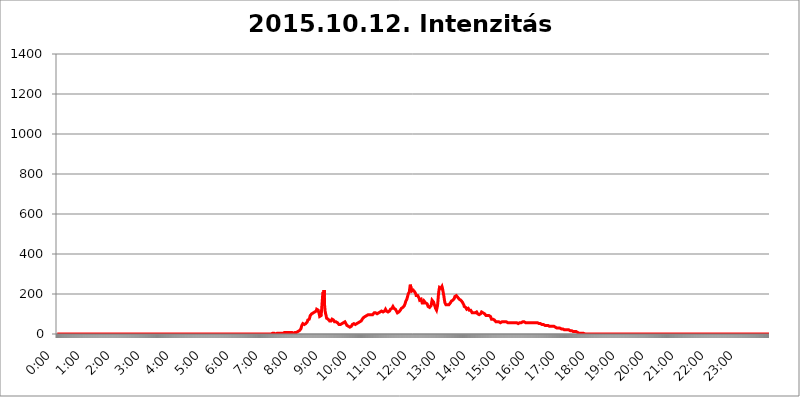
| Category | 2015.10.12. Intenzitás [W/m^2] |
|---|---|
| 0.0 | 0 |
| 0.0006944444444444445 | 0 |
| 0.001388888888888889 | 0 |
| 0.0020833333333333333 | 0 |
| 0.002777777777777778 | 0 |
| 0.003472222222222222 | 0 |
| 0.004166666666666667 | 0 |
| 0.004861111111111111 | 0 |
| 0.005555555555555556 | 0 |
| 0.0062499999999999995 | 0 |
| 0.006944444444444444 | 0 |
| 0.007638888888888889 | 0 |
| 0.008333333333333333 | 0 |
| 0.009027777777777779 | 0 |
| 0.009722222222222222 | 0 |
| 0.010416666666666666 | 0 |
| 0.011111111111111112 | 0 |
| 0.011805555555555555 | 0 |
| 0.012499999999999999 | 0 |
| 0.013194444444444444 | 0 |
| 0.013888888888888888 | 0 |
| 0.014583333333333332 | 0 |
| 0.015277777777777777 | 0 |
| 0.015972222222222224 | 0 |
| 0.016666666666666666 | 0 |
| 0.017361111111111112 | 0 |
| 0.018055555555555557 | 0 |
| 0.01875 | 0 |
| 0.019444444444444445 | 0 |
| 0.02013888888888889 | 0 |
| 0.020833333333333332 | 0 |
| 0.02152777777777778 | 0 |
| 0.022222222222222223 | 0 |
| 0.02291666666666667 | 0 |
| 0.02361111111111111 | 0 |
| 0.024305555555555556 | 0 |
| 0.024999999999999998 | 0 |
| 0.025694444444444447 | 0 |
| 0.02638888888888889 | 0 |
| 0.027083333333333334 | 0 |
| 0.027777777777777776 | 0 |
| 0.02847222222222222 | 0 |
| 0.029166666666666664 | 0 |
| 0.029861111111111113 | 0 |
| 0.030555555555555555 | 0 |
| 0.03125 | 0 |
| 0.03194444444444445 | 0 |
| 0.03263888888888889 | 0 |
| 0.03333333333333333 | 0 |
| 0.034027777777777775 | 0 |
| 0.034722222222222224 | 0 |
| 0.035416666666666666 | 0 |
| 0.036111111111111115 | 0 |
| 0.03680555555555556 | 0 |
| 0.0375 | 0 |
| 0.03819444444444444 | 0 |
| 0.03888888888888889 | 0 |
| 0.03958333333333333 | 0 |
| 0.04027777777777778 | 0 |
| 0.04097222222222222 | 0 |
| 0.041666666666666664 | 0 |
| 0.042361111111111106 | 0 |
| 0.04305555555555556 | 0 |
| 0.043750000000000004 | 0 |
| 0.044444444444444446 | 0 |
| 0.04513888888888889 | 0 |
| 0.04583333333333334 | 0 |
| 0.04652777777777778 | 0 |
| 0.04722222222222222 | 0 |
| 0.04791666666666666 | 0 |
| 0.04861111111111111 | 0 |
| 0.049305555555555554 | 0 |
| 0.049999999999999996 | 0 |
| 0.05069444444444445 | 0 |
| 0.051388888888888894 | 0 |
| 0.052083333333333336 | 0 |
| 0.05277777777777778 | 0 |
| 0.05347222222222222 | 0 |
| 0.05416666666666667 | 0 |
| 0.05486111111111111 | 0 |
| 0.05555555555555555 | 0 |
| 0.05625 | 0 |
| 0.05694444444444444 | 0 |
| 0.057638888888888885 | 0 |
| 0.05833333333333333 | 0 |
| 0.05902777777777778 | 0 |
| 0.059722222222222225 | 0 |
| 0.06041666666666667 | 0 |
| 0.061111111111111116 | 0 |
| 0.06180555555555556 | 0 |
| 0.0625 | 0 |
| 0.06319444444444444 | 0 |
| 0.06388888888888888 | 0 |
| 0.06458333333333334 | 0 |
| 0.06527777777777778 | 0 |
| 0.06597222222222222 | 0 |
| 0.06666666666666667 | 0 |
| 0.06736111111111111 | 0 |
| 0.06805555555555555 | 0 |
| 0.06874999999999999 | 0 |
| 0.06944444444444443 | 0 |
| 0.07013888888888889 | 0 |
| 0.07083333333333333 | 0 |
| 0.07152777777777779 | 0 |
| 0.07222222222222223 | 0 |
| 0.07291666666666667 | 0 |
| 0.07361111111111111 | 0 |
| 0.07430555555555556 | 0 |
| 0.075 | 0 |
| 0.07569444444444444 | 0 |
| 0.0763888888888889 | 0 |
| 0.07708333333333334 | 0 |
| 0.07777777777777778 | 0 |
| 0.07847222222222222 | 0 |
| 0.07916666666666666 | 0 |
| 0.0798611111111111 | 0 |
| 0.08055555555555556 | 0 |
| 0.08125 | 0 |
| 0.08194444444444444 | 0 |
| 0.08263888888888889 | 0 |
| 0.08333333333333333 | 0 |
| 0.08402777777777777 | 0 |
| 0.08472222222222221 | 0 |
| 0.08541666666666665 | 0 |
| 0.08611111111111112 | 0 |
| 0.08680555555555557 | 0 |
| 0.08750000000000001 | 0 |
| 0.08819444444444445 | 0 |
| 0.08888888888888889 | 0 |
| 0.08958333333333333 | 0 |
| 0.09027777777777778 | 0 |
| 0.09097222222222222 | 0 |
| 0.09166666666666667 | 0 |
| 0.09236111111111112 | 0 |
| 0.09305555555555556 | 0 |
| 0.09375 | 0 |
| 0.09444444444444444 | 0 |
| 0.09513888888888888 | 0 |
| 0.09583333333333333 | 0 |
| 0.09652777777777777 | 0 |
| 0.09722222222222222 | 0 |
| 0.09791666666666667 | 0 |
| 0.09861111111111111 | 0 |
| 0.09930555555555555 | 0 |
| 0.09999999999999999 | 0 |
| 0.10069444444444443 | 0 |
| 0.1013888888888889 | 0 |
| 0.10208333333333335 | 0 |
| 0.10277777777777779 | 0 |
| 0.10347222222222223 | 0 |
| 0.10416666666666667 | 0 |
| 0.10486111111111111 | 0 |
| 0.10555555555555556 | 0 |
| 0.10625 | 0 |
| 0.10694444444444444 | 0 |
| 0.1076388888888889 | 0 |
| 0.10833333333333334 | 0 |
| 0.10902777777777778 | 0 |
| 0.10972222222222222 | 0 |
| 0.1111111111111111 | 0 |
| 0.11180555555555556 | 0 |
| 0.11180555555555556 | 0 |
| 0.1125 | 0 |
| 0.11319444444444444 | 0 |
| 0.11388888888888889 | 0 |
| 0.11458333333333333 | 0 |
| 0.11527777777777777 | 0 |
| 0.11597222222222221 | 0 |
| 0.11666666666666665 | 0 |
| 0.1173611111111111 | 0 |
| 0.11805555555555557 | 0 |
| 0.11944444444444445 | 0 |
| 0.12013888888888889 | 0 |
| 0.12083333333333333 | 0 |
| 0.12152777777777778 | 0 |
| 0.12222222222222223 | 0 |
| 0.12291666666666667 | 0 |
| 0.12291666666666667 | 0 |
| 0.12361111111111112 | 0 |
| 0.12430555555555556 | 0 |
| 0.125 | 0 |
| 0.12569444444444444 | 0 |
| 0.12638888888888888 | 0 |
| 0.12708333333333333 | 0 |
| 0.16875 | 0 |
| 0.12847222222222224 | 0 |
| 0.12916666666666668 | 0 |
| 0.12986111111111112 | 0 |
| 0.13055555555555556 | 0 |
| 0.13125 | 0 |
| 0.13194444444444445 | 0 |
| 0.1326388888888889 | 0 |
| 0.13333333333333333 | 0 |
| 0.13402777777777777 | 0 |
| 0.13402777777777777 | 0 |
| 0.13472222222222222 | 0 |
| 0.13541666666666666 | 0 |
| 0.1361111111111111 | 0 |
| 0.13749999999999998 | 0 |
| 0.13819444444444443 | 0 |
| 0.1388888888888889 | 0 |
| 0.13958333333333334 | 0 |
| 0.14027777777777778 | 0 |
| 0.14097222222222222 | 0 |
| 0.14166666666666666 | 0 |
| 0.1423611111111111 | 0 |
| 0.14305555555555557 | 0 |
| 0.14375000000000002 | 0 |
| 0.14444444444444446 | 0 |
| 0.1451388888888889 | 0 |
| 0.1451388888888889 | 0 |
| 0.14652777777777778 | 0 |
| 0.14722222222222223 | 0 |
| 0.14791666666666667 | 0 |
| 0.1486111111111111 | 0 |
| 0.14930555555555555 | 0 |
| 0.15 | 0 |
| 0.15069444444444444 | 0 |
| 0.15138888888888888 | 0 |
| 0.15208333333333332 | 0 |
| 0.15277777777777776 | 0 |
| 0.15347222222222223 | 0 |
| 0.15416666666666667 | 0 |
| 0.15486111111111112 | 0 |
| 0.15555555555555556 | 0 |
| 0.15625 | 0 |
| 0.15694444444444444 | 0 |
| 0.15763888888888888 | 0 |
| 0.15833333333333333 | 0 |
| 0.15902777777777777 | 0 |
| 0.15972222222222224 | 0 |
| 0.16041666666666668 | 0 |
| 0.16111111111111112 | 0 |
| 0.16180555555555556 | 0 |
| 0.1625 | 0 |
| 0.16319444444444445 | 0 |
| 0.1638888888888889 | 0 |
| 0.16458333333333333 | 0 |
| 0.16527777777777777 | 0 |
| 0.16597222222222222 | 0 |
| 0.16666666666666666 | 0 |
| 0.1673611111111111 | 0 |
| 0.16805555555555554 | 0 |
| 0.16874999999999998 | 0 |
| 0.16944444444444443 | 0 |
| 0.17013888888888887 | 0 |
| 0.1708333333333333 | 0 |
| 0.17152777777777775 | 0 |
| 0.17222222222222225 | 0 |
| 0.1729166666666667 | 0 |
| 0.17361111111111113 | 0 |
| 0.17430555555555557 | 0 |
| 0.17500000000000002 | 0 |
| 0.17569444444444446 | 0 |
| 0.1763888888888889 | 0 |
| 0.17708333333333334 | 0 |
| 0.17777777777777778 | 0 |
| 0.17847222222222223 | 0 |
| 0.17916666666666667 | 0 |
| 0.1798611111111111 | 0 |
| 0.18055555555555555 | 0 |
| 0.18125 | 0 |
| 0.18194444444444444 | 0 |
| 0.1826388888888889 | 0 |
| 0.18333333333333335 | 0 |
| 0.1840277777777778 | 0 |
| 0.18472222222222223 | 0 |
| 0.18541666666666667 | 0 |
| 0.18611111111111112 | 0 |
| 0.18680555555555556 | 0 |
| 0.1875 | 0 |
| 0.18819444444444444 | 0 |
| 0.18888888888888888 | 0 |
| 0.18958333333333333 | 0 |
| 0.19027777777777777 | 0 |
| 0.1909722222222222 | 0 |
| 0.19166666666666665 | 0 |
| 0.19236111111111112 | 0 |
| 0.19305555555555554 | 0 |
| 0.19375 | 0 |
| 0.19444444444444445 | 0 |
| 0.1951388888888889 | 0 |
| 0.19583333333333333 | 0 |
| 0.19652777777777777 | 0 |
| 0.19722222222222222 | 0 |
| 0.19791666666666666 | 0 |
| 0.1986111111111111 | 0 |
| 0.19930555555555554 | 0 |
| 0.19999999999999998 | 0 |
| 0.20069444444444443 | 0 |
| 0.20138888888888887 | 0 |
| 0.2020833333333333 | 0 |
| 0.2027777777777778 | 0 |
| 0.2034722222222222 | 0 |
| 0.2041666666666667 | 0 |
| 0.20486111111111113 | 0 |
| 0.20555555555555557 | 0 |
| 0.20625000000000002 | 0 |
| 0.20694444444444446 | 0 |
| 0.2076388888888889 | 0 |
| 0.20833333333333334 | 0 |
| 0.20902777777777778 | 0 |
| 0.20972222222222223 | 0 |
| 0.21041666666666667 | 0 |
| 0.2111111111111111 | 0 |
| 0.21180555555555555 | 0 |
| 0.2125 | 0 |
| 0.21319444444444444 | 0 |
| 0.2138888888888889 | 0 |
| 0.21458333333333335 | 0 |
| 0.2152777777777778 | 0 |
| 0.21597222222222223 | 0 |
| 0.21666666666666667 | 0 |
| 0.21736111111111112 | 0 |
| 0.21805555555555556 | 0 |
| 0.21875 | 0 |
| 0.21944444444444444 | 0 |
| 0.22013888888888888 | 0 |
| 0.22083333333333333 | 0 |
| 0.22152777777777777 | 0 |
| 0.2222222222222222 | 0 |
| 0.22291666666666665 | 0 |
| 0.2236111111111111 | 0 |
| 0.22430555555555556 | 0 |
| 0.225 | 0 |
| 0.22569444444444445 | 0 |
| 0.2263888888888889 | 0 |
| 0.22708333333333333 | 0 |
| 0.22777777777777777 | 0 |
| 0.22847222222222222 | 0 |
| 0.22916666666666666 | 0 |
| 0.2298611111111111 | 0 |
| 0.23055555555555554 | 0 |
| 0.23124999999999998 | 0 |
| 0.23194444444444443 | 0 |
| 0.23263888888888887 | 0 |
| 0.2333333333333333 | 0 |
| 0.2340277777777778 | 0 |
| 0.2347222222222222 | 0 |
| 0.2354166666666667 | 0 |
| 0.23611111111111113 | 0 |
| 0.23680555555555557 | 0 |
| 0.23750000000000002 | 0 |
| 0.23819444444444446 | 0 |
| 0.2388888888888889 | 0 |
| 0.23958333333333334 | 0 |
| 0.24027777777777778 | 0 |
| 0.24097222222222223 | 0 |
| 0.24166666666666667 | 0 |
| 0.2423611111111111 | 0 |
| 0.24305555555555555 | 0 |
| 0.24375 | 0 |
| 0.24444444444444446 | 0 |
| 0.24513888888888888 | 0 |
| 0.24583333333333335 | 0 |
| 0.2465277777777778 | 0 |
| 0.24722222222222223 | 0 |
| 0.24791666666666667 | 0 |
| 0.24861111111111112 | 0 |
| 0.24930555555555556 | 0 |
| 0.25 | 0 |
| 0.25069444444444444 | 0 |
| 0.2513888888888889 | 0 |
| 0.2520833333333333 | 0 |
| 0.25277777777777777 | 0 |
| 0.2534722222222222 | 0 |
| 0.25416666666666665 | 0 |
| 0.2548611111111111 | 0 |
| 0.2555555555555556 | 0 |
| 0.25625000000000003 | 0 |
| 0.2569444444444445 | 0 |
| 0.2576388888888889 | 0 |
| 0.25833333333333336 | 0 |
| 0.2590277777777778 | 0 |
| 0.25972222222222224 | 0 |
| 0.2604166666666667 | 0 |
| 0.2611111111111111 | 0 |
| 0.26180555555555557 | 0 |
| 0.2625 | 0 |
| 0.26319444444444445 | 0 |
| 0.2638888888888889 | 0 |
| 0.26458333333333334 | 0 |
| 0.2652777777777778 | 0 |
| 0.2659722222222222 | 0 |
| 0.26666666666666666 | 0 |
| 0.2673611111111111 | 0 |
| 0.26805555555555555 | 0 |
| 0.26875 | 0 |
| 0.26944444444444443 | 0 |
| 0.2701388888888889 | 0 |
| 0.2708333333333333 | 0 |
| 0.27152777777777776 | 0 |
| 0.2722222222222222 | 0 |
| 0.27291666666666664 | 0 |
| 0.2736111111111111 | 0 |
| 0.2743055555555555 | 0 |
| 0.27499999999999997 | 0 |
| 0.27569444444444446 | 0 |
| 0.27638888888888885 | 0 |
| 0.27708333333333335 | 0 |
| 0.2777777777777778 | 0 |
| 0.27847222222222223 | 0 |
| 0.2791666666666667 | 0 |
| 0.2798611111111111 | 0 |
| 0.28055555555555556 | 0 |
| 0.28125 | 0 |
| 0.28194444444444444 | 0 |
| 0.2826388888888889 | 0 |
| 0.2833333333333333 | 0 |
| 0.28402777777777777 | 0 |
| 0.2847222222222222 | 0 |
| 0.28541666666666665 | 0 |
| 0.28611111111111115 | 0 |
| 0.28680555555555554 | 0 |
| 0.28750000000000003 | 0 |
| 0.2881944444444445 | 0 |
| 0.2888888888888889 | 0 |
| 0.28958333333333336 | 0 |
| 0.2902777777777778 | 0 |
| 0.29097222222222224 | 0 |
| 0.2916666666666667 | 0 |
| 0.2923611111111111 | 0 |
| 0.29305555555555557 | 0 |
| 0.29375 | 0 |
| 0.29444444444444445 | 0 |
| 0.2951388888888889 | 0 |
| 0.29583333333333334 | 0 |
| 0.2965277777777778 | 0 |
| 0.2972222222222222 | 0 |
| 0.29791666666666666 | 0 |
| 0.2986111111111111 | 0 |
| 0.29930555555555555 | 0 |
| 0.3 | 0 |
| 0.30069444444444443 | 0 |
| 0.3013888888888889 | 0 |
| 0.3020833333333333 | 3.525 |
| 0.30277777777777776 | 3.525 |
| 0.3034722222222222 | 3.525 |
| 0.30416666666666664 | 3.525 |
| 0.3048611111111111 | 0 |
| 0.3055555555555555 | 0 |
| 0.30624999999999997 | 0 |
| 0.3069444444444444 | 3.525 |
| 0.3076388888888889 | 3.525 |
| 0.30833333333333335 | 3.525 |
| 0.3090277777777778 | 3.525 |
| 0.30972222222222223 | 3.525 |
| 0.3104166666666667 | 3.525 |
| 0.3111111111111111 | 3.525 |
| 0.31180555555555556 | 3.525 |
| 0.3125 | 3.525 |
| 0.31319444444444444 | 3.525 |
| 0.3138888888888889 | 3.525 |
| 0.3145833333333333 | 3.525 |
| 0.31527777777777777 | 3.525 |
| 0.3159722222222222 | 3.525 |
| 0.31666666666666665 | 3.525 |
| 0.31736111111111115 | 3.525 |
| 0.31805555555555554 | 3.525 |
| 0.31875000000000003 | 7.887 |
| 0.3194444444444445 | 7.887 |
| 0.3201388888888889 | 3.525 |
| 0.32083333333333336 | 7.887 |
| 0.3215277777777778 | 7.887 |
| 0.32222222222222224 | 7.887 |
| 0.3229166666666667 | 7.887 |
| 0.3236111111111111 | 7.887 |
| 0.32430555555555557 | 7.887 |
| 0.325 | 7.887 |
| 0.32569444444444445 | 7.887 |
| 0.3263888888888889 | 7.887 |
| 0.32708333333333334 | 7.887 |
| 0.3277777777777778 | 7.887 |
| 0.3284722222222222 | 7.887 |
| 0.32916666666666666 | 7.887 |
| 0.3298611111111111 | 3.525 |
| 0.33055555555555555 | 3.525 |
| 0.33125 | 3.525 |
| 0.33194444444444443 | 3.525 |
| 0.3326388888888889 | 3.525 |
| 0.3333333333333333 | 7.887 |
| 0.3340277777777778 | 7.887 |
| 0.3347222222222222 | 7.887 |
| 0.3354166666666667 | 7.887 |
| 0.3361111111111111 | 7.887 |
| 0.3368055555555556 | 12.257 |
| 0.33749999999999997 | 12.257 |
| 0.33819444444444446 | 12.257 |
| 0.33888888888888885 | 12.257 |
| 0.33958333333333335 | 16.636 |
| 0.34027777777777773 | 16.636 |
| 0.34097222222222223 | 21.024 |
| 0.3416666666666666 | 25.419 |
| 0.3423611111111111 | 34.234 |
| 0.3430555555555555 | 43.079 |
| 0.34375 | 47.511 |
| 0.3444444444444445 | 51.951 |
| 0.3451388888888889 | 51.951 |
| 0.3458333333333334 | 47.511 |
| 0.34652777777777777 | 47.511 |
| 0.34722222222222227 | 47.511 |
| 0.34791666666666665 | 47.511 |
| 0.34861111111111115 | 51.951 |
| 0.34930555555555554 | 56.398 |
| 0.35000000000000003 | 56.398 |
| 0.3506944444444444 | 60.85 |
| 0.3513888888888889 | 69.775 |
| 0.3520833333333333 | 74.246 |
| 0.3527777777777778 | 74.246 |
| 0.3534722222222222 | 74.246 |
| 0.3541666666666667 | 83.205 |
| 0.3548611111111111 | 92.184 |
| 0.35555555555555557 | 87.692 |
| 0.35625 | 92.184 |
| 0.35694444444444445 | 101.184 |
| 0.3576388888888889 | 105.69 |
| 0.35833333333333334 | 105.69 |
| 0.3590277777777778 | 105.69 |
| 0.3597222222222222 | 105.69 |
| 0.36041666666666666 | 110.201 |
| 0.3611111111111111 | 110.201 |
| 0.36180555555555555 | 110.201 |
| 0.3625 | 110.201 |
| 0.36319444444444443 | 114.716 |
| 0.3638888888888889 | 123.758 |
| 0.3645833333333333 | 128.284 |
| 0.3652777777777778 | 119.235 |
| 0.3659722222222222 | 119.235 |
| 0.3666666666666667 | 119.235 |
| 0.3673611111111111 | 101.184 |
| 0.3680555555555556 | 87.692 |
| 0.36874999999999997 | 83.205 |
| 0.36944444444444446 | 83.205 |
| 0.37013888888888885 | 92.184 |
| 0.37083333333333335 | 123.758 |
| 0.37152777777777773 | 128.284 |
| 0.37222222222222223 | 191.937 |
| 0.3729166666666666 | 210.182 |
| 0.3736111111111111 | 191.937 |
| 0.3743055555555555 | 219.309 |
| 0.375 | 141.884 |
| 0.3756944444444445 | 114.716 |
| 0.3763888888888889 | 101.184 |
| 0.3770833333333334 | 92.184 |
| 0.37777777777777777 | 78.722 |
| 0.37847222222222227 | 74.246 |
| 0.37916666666666665 | 78.722 |
| 0.37986111111111115 | 74.246 |
| 0.38055555555555554 | 74.246 |
| 0.38125000000000003 | 69.775 |
| 0.3819444444444444 | 65.31 |
| 0.3826388888888889 | 65.31 |
| 0.3833333333333333 | 65.31 |
| 0.3840277777777778 | 65.31 |
| 0.3847222222222222 | 69.775 |
| 0.3854166666666667 | 74.246 |
| 0.3861111111111111 | 74.246 |
| 0.38680555555555557 | 74.246 |
| 0.3875 | 69.775 |
| 0.38819444444444445 | 65.31 |
| 0.3888888888888889 | 60.85 |
| 0.38958333333333334 | 65.31 |
| 0.3902777777777778 | 65.31 |
| 0.3909722222222222 | 60.85 |
| 0.39166666666666666 | 60.85 |
| 0.3923611111111111 | 56.398 |
| 0.39305555555555555 | 56.398 |
| 0.39375 | 56.398 |
| 0.39444444444444443 | 51.951 |
| 0.3951388888888889 | 47.511 |
| 0.3958333333333333 | 47.511 |
| 0.3965277777777778 | 47.511 |
| 0.3972222222222222 | 47.511 |
| 0.3979166666666667 | 51.951 |
| 0.3986111111111111 | 51.951 |
| 0.3993055555555556 | 51.951 |
| 0.39999999999999997 | 51.951 |
| 0.40069444444444446 | 51.951 |
| 0.40138888888888885 | 56.398 |
| 0.40208333333333335 | 60.85 |
| 0.40277777777777773 | 60.85 |
| 0.40347222222222223 | 60.85 |
| 0.4041666666666666 | 56.398 |
| 0.4048611111111111 | 51.951 |
| 0.4055555555555555 | 51.951 |
| 0.40625 | 43.079 |
| 0.4069444444444445 | 38.653 |
| 0.4076388888888889 | 38.653 |
| 0.4083333333333334 | 38.653 |
| 0.40902777777777777 | 34.234 |
| 0.40972222222222227 | 34.234 |
| 0.41041666666666665 | 34.234 |
| 0.41111111111111115 | 34.234 |
| 0.41180555555555554 | 38.653 |
| 0.41250000000000003 | 38.653 |
| 0.4131944444444444 | 43.079 |
| 0.4138888888888889 | 47.511 |
| 0.4145833333333333 | 47.511 |
| 0.4152777777777778 | 51.951 |
| 0.4159722222222222 | 51.951 |
| 0.4166666666666667 | 51.951 |
| 0.4173611111111111 | 51.951 |
| 0.41805555555555557 | 47.511 |
| 0.41875 | 51.951 |
| 0.41944444444444445 | 51.951 |
| 0.4201388888888889 | 51.951 |
| 0.42083333333333334 | 51.951 |
| 0.4215277777777778 | 56.398 |
| 0.4222222222222222 | 56.398 |
| 0.42291666666666666 | 60.85 |
| 0.4236111111111111 | 60.85 |
| 0.42430555555555555 | 60.85 |
| 0.425 | 65.31 |
| 0.42569444444444443 | 65.31 |
| 0.4263888888888889 | 65.31 |
| 0.4270833333333333 | 69.775 |
| 0.4277777777777778 | 74.246 |
| 0.4284722222222222 | 74.246 |
| 0.4291666666666667 | 78.722 |
| 0.4298611111111111 | 83.205 |
| 0.4305555555555556 | 83.205 |
| 0.43124999999999997 | 87.692 |
| 0.43194444444444446 | 87.692 |
| 0.43263888888888885 | 92.184 |
| 0.43333333333333335 | 92.184 |
| 0.43402777777777773 | 92.184 |
| 0.43472222222222223 | 96.682 |
| 0.4354166666666666 | 96.682 |
| 0.4361111111111111 | 96.682 |
| 0.4368055555555555 | 96.682 |
| 0.4375 | 96.682 |
| 0.4381944444444445 | 96.682 |
| 0.4388888888888889 | 101.184 |
| 0.4395833333333334 | 101.184 |
| 0.44027777777777777 | 96.682 |
| 0.44097222222222227 | 96.682 |
| 0.44166666666666665 | 96.682 |
| 0.44236111111111115 | 96.682 |
| 0.44305555555555554 | 101.184 |
| 0.44375000000000003 | 101.184 |
| 0.4444444444444444 | 105.69 |
| 0.4451388888888889 | 105.69 |
| 0.4458333333333333 | 105.69 |
| 0.4465277777777778 | 105.69 |
| 0.4472222222222222 | 101.184 |
| 0.4479166666666667 | 101.184 |
| 0.4486111111111111 | 101.184 |
| 0.44930555555555557 | 101.184 |
| 0.45 | 105.69 |
| 0.45069444444444445 | 105.69 |
| 0.4513888888888889 | 110.201 |
| 0.45208333333333334 | 110.201 |
| 0.4527777777777778 | 110.201 |
| 0.4534722222222222 | 110.201 |
| 0.45416666666666666 | 114.716 |
| 0.4548611111111111 | 114.716 |
| 0.45555555555555555 | 114.716 |
| 0.45625 | 114.716 |
| 0.45694444444444443 | 110.201 |
| 0.4576388888888889 | 110.201 |
| 0.4583333333333333 | 110.201 |
| 0.4590277777777778 | 114.716 |
| 0.4597222222222222 | 119.235 |
| 0.4604166666666667 | 123.758 |
| 0.4611111111111111 | 123.758 |
| 0.4618055555555556 | 114.716 |
| 0.46249999999999997 | 110.201 |
| 0.46319444444444446 | 110.201 |
| 0.46388888888888885 | 110.201 |
| 0.46458333333333335 | 105.69 |
| 0.46527777777777773 | 110.201 |
| 0.46597222222222223 | 114.716 |
| 0.4666666666666666 | 119.235 |
| 0.4673611111111111 | 123.758 |
| 0.4680555555555555 | 123.758 |
| 0.46875 | 123.758 |
| 0.4694444444444445 | 128.284 |
| 0.4701388888888889 | 132.814 |
| 0.4708333333333334 | 137.347 |
| 0.47152777777777777 | 132.814 |
| 0.47222222222222227 | 128.284 |
| 0.47291666666666665 | 128.284 |
| 0.47361111111111115 | 123.758 |
| 0.47430555555555554 | 123.758 |
| 0.47500000000000003 | 119.235 |
| 0.4756944444444444 | 114.716 |
| 0.4763888888888889 | 110.201 |
| 0.4770833333333333 | 105.69 |
| 0.4777777777777778 | 110.201 |
| 0.4784722222222222 | 110.201 |
| 0.4791666666666667 | 110.201 |
| 0.4798611111111111 | 110.201 |
| 0.48055555555555557 | 114.716 |
| 0.48125 | 119.235 |
| 0.48194444444444445 | 123.758 |
| 0.4826388888888889 | 128.284 |
| 0.48333333333333334 | 128.284 |
| 0.4840277777777778 | 128.284 |
| 0.4847222222222222 | 132.814 |
| 0.48541666666666666 | 137.347 |
| 0.4861111111111111 | 137.347 |
| 0.48680555555555555 | 141.884 |
| 0.4875 | 146.423 |
| 0.48819444444444443 | 155.509 |
| 0.4888888888888889 | 164.605 |
| 0.4895833333333333 | 164.605 |
| 0.4902777777777778 | 173.709 |
| 0.4909722222222222 | 182.82 |
| 0.4916666666666667 | 191.937 |
| 0.4923611111111111 | 201.058 |
| 0.4930555555555556 | 201.058 |
| 0.49374999999999997 | 210.182 |
| 0.49444444444444446 | 228.436 |
| 0.49513888888888885 | 246.689 |
| 0.49583333333333335 | 242.127 |
| 0.49652777777777773 | 223.873 |
| 0.49722222222222223 | 214.746 |
| 0.4979166666666666 | 214.746 |
| 0.4986111111111111 | 219.309 |
| 0.4993055555555555 | 219.309 |
| 0.5 | 219.309 |
| 0.5006944444444444 | 214.746 |
| 0.5013888888888889 | 210.182 |
| 0.5020833333333333 | 205.62 |
| 0.5027777777777778 | 201.058 |
| 0.5034722222222222 | 191.937 |
| 0.5041666666666667 | 191.937 |
| 0.5048611111111111 | 187.378 |
| 0.5055555555555555 | 191.937 |
| 0.50625 | 191.937 |
| 0.5069444444444444 | 191.937 |
| 0.5076388888888889 | 178.264 |
| 0.5083333333333333 | 169.156 |
| 0.5090277777777777 | 169.156 |
| 0.5097222222222222 | 173.709 |
| 0.5104166666666666 | 173.709 |
| 0.5111111111111112 | 169.156 |
| 0.5118055555555555 | 155.509 |
| 0.5125000000000001 | 150.964 |
| 0.5131944444444444 | 150.964 |
| 0.513888888888889 | 155.509 |
| 0.5145833333333333 | 164.605 |
| 0.5152777777777778 | 164.605 |
| 0.5159722222222222 | 160.056 |
| 0.5166666666666667 | 155.509 |
| 0.517361111111111 | 155.509 |
| 0.5180555555555556 | 155.509 |
| 0.5187499999999999 | 150.964 |
| 0.5194444444444445 | 146.423 |
| 0.5201388888888888 | 137.347 |
| 0.5208333333333334 | 137.347 |
| 0.5215277777777778 | 132.814 |
| 0.5222222222222223 | 132.814 |
| 0.5229166666666667 | 132.814 |
| 0.5236111111111111 | 132.814 |
| 0.5243055555555556 | 141.884 |
| 0.525 | 155.509 |
| 0.5256944444444445 | 169.156 |
| 0.5263888888888889 | 173.709 |
| 0.5270833333333333 | 173.709 |
| 0.5277777777777778 | 160.056 |
| 0.5284722222222222 | 150.964 |
| 0.5291666666666667 | 146.423 |
| 0.5298611111111111 | 137.347 |
| 0.5305555555555556 | 128.284 |
| 0.53125 | 123.758 |
| 0.5319444444444444 | 119.235 |
| 0.5326388888888889 | 123.758 |
| 0.5333333333333333 | 141.884 |
| 0.5340277777777778 | 169.156 |
| 0.5347222222222222 | 201.058 |
| 0.5354166666666667 | 219.309 |
| 0.5361111111111111 | 233 |
| 0.5368055555555555 | 233 |
| 0.5375 | 233 |
| 0.5381944444444444 | 228.436 |
| 0.5388888888888889 | 233 |
| 0.5395833333333333 | 237.564 |
| 0.5402777777777777 | 228.436 |
| 0.5409722222222222 | 214.746 |
| 0.5416666666666666 | 201.058 |
| 0.5423611111111112 | 187.378 |
| 0.5430555555555555 | 169.156 |
| 0.5437500000000001 | 155.509 |
| 0.5444444444444444 | 150.964 |
| 0.545138888888889 | 146.423 |
| 0.5458333333333333 | 141.884 |
| 0.5465277777777778 | 146.423 |
| 0.5472222222222222 | 146.423 |
| 0.5479166666666667 | 141.884 |
| 0.548611111111111 | 141.884 |
| 0.5493055555555556 | 146.423 |
| 0.5499999999999999 | 146.423 |
| 0.5506944444444445 | 146.423 |
| 0.5513888888888888 | 155.509 |
| 0.5520833333333334 | 160.056 |
| 0.5527777777777778 | 164.605 |
| 0.5534722222222223 | 164.605 |
| 0.5541666666666667 | 169.156 |
| 0.5548611111111111 | 169.156 |
| 0.5555555555555556 | 173.709 |
| 0.55625 | 173.709 |
| 0.5569444444444445 | 178.264 |
| 0.5576388888888889 | 187.378 |
| 0.5583333333333333 | 191.937 |
| 0.5590277777777778 | 191.937 |
| 0.5597222222222222 | 191.937 |
| 0.5604166666666667 | 187.378 |
| 0.5611111111111111 | 187.378 |
| 0.5618055555555556 | 182.82 |
| 0.5625 | 182.82 |
| 0.5631944444444444 | 178.264 |
| 0.5638888888888889 | 173.709 |
| 0.5645833333333333 | 173.709 |
| 0.5652777777777778 | 169.156 |
| 0.5659722222222222 | 169.156 |
| 0.5666666666666667 | 164.605 |
| 0.5673611111111111 | 164.605 |
| 0.5680555555555555 | 160.056 |
| 0.56875 | 160.056 |
| 0.5694444444444444 | 155.509 |
| 0.5701388888888889 | 146.423 |
| 0.5708333333333333 | 137.347 |
| 0.5715277777777777 | 141.884 |
| 0.5722222222222222 | 137.347 |
| 0.5729166666666666 | 132.814 |
| 0.5736111111111112 | 128.284 |
| 0.5743055555555555 | 123.758 |
| 0.5750000000000001 | 123.758 |
| 0.5756944444444444 | 128.284 |
| 0.576388888888889 | 128.284 |
| 0.5770833333333333 | 128.284 |
| 0.5777777777777778 | 119.235 |
| 0.5784722222222222 | 119.235 |
| 0.5791666666666667 | 114.716 |
| 0.579861111111111 | 119.235 |
| 0.5805555555555556 | 119.235 |
| 0.5812499999999999 | 114.716 |
| 0.5819444444444445 | 105.69 |
| 0.5826388888888888 | 101.184 |
| 0.5833333333333334 | 101.184 |
| 0.5840277777777778 | 105.69 |
| 0.5847222222222223 | 101.184 |
| 0.5854166666666667 | 101.184 |
| 0.5861111111111111 | 105.69 |
| 0.5868055555555556 | 110.201 |
| 0.5875 | 110.201 |
| 0.5881944444444445 | 110.201 |
| 0.5888888888888889 | 105.69 |
| 0.5895833333333333 | 101.184 |
| 0.5902777777777778 | 101.184 |
| 0.5909722222222222 | 101.184 |
| 0.5916666666666667 | 96.682 |
| 0.5923611111111111 | 96.682 |
| 0.5930555555555556 | 96.682 |
| 0.59375 | 101.184 |
| 0.5944444444444444 | 105.69 |
| 0.5951388888888889 | 110.201 |
| 0.5958333333333333 | 110.201 |
| 0.5965277777777778 | 110.201 |
| 0.5972222222222222 | 105.69 |
| 0.5979166666666667 | 101.184 |
| 0.5986111111111111 | 101.184 |
| 0.5993055555555555 | 101.184 |
| 0.6 | 96.682 |
| 0.6006944444444444 | 96.682 |
| 0.6013888888888889 | 92.184 |
| 0.6020833333333333 | 92.184 |
| 0.6027777777777777 | 87.692 |
| 0.6034722222222222 | 92.184 |
| 0.6041666666666666 | 92.184 |
| 0.6048611111111112 | 96.682 |
| 0.6055555555555555 | 92.184 |
| 0.6062500000000001 | 92.184 |
| 0.6069444444444444 | 92.184 |
| 0.607638888888889 | 87.692 |
| 0.6083333333333333 | 83.205 |
| 0.6090277777777778 | 74.246 |
| 0.6097222222222222 | 74.246 |
| 0.6104166666666667 | 69.775 |
| 0.611111111111111 | 74.246 |
| 0.6118055555555556 | 74.246 |
| 0.6124999999999999 | 69.775 |
| 0.6131944444444445 | 69.775 |
| 0.6138888888888888 | 65.31 |
| 0.6145833333333334 | 65.31 |
| 0.6152777777777778 | 60.85 |
| 0.6159722222222223 | 60.85 |
| 0.6166666666666667 | 60.85 |
| 0.6173611111111111 | 60.85 |
| 0.6180555555555556 | 60.85 |
| 0.61875 | 60.85 |
| 0.6194444444444445 | 60.85 |
| 0.6201388888888889 | 60.85 |
| 0.6208333333333333 | 56.398 |
| 0.6215277777777778 | 56.398 |
| 0.6222222222222222 | 56.398 |
| 0.6229166666666667 | 56.398 |
| 0.6236111111111111 | 60.85 |
| 0.6243055555555556 | 60.85 |
| 0.625 | 60.85 |
| 0.6256944444444444 | 60.85 |
| 0.6263888888888889 | 60.85 |
| 0.6270833333333333 | 60.85 |
| 0.6277777777777778 | 60.85 |
| 0.6284722222222222 | 60.85 |
| 0.6291666666666667 | 60.85 |
| 0.6298611111111111 | 60.85 |
| 0.6305555555555555 | 60.85 |
| 0.63125 | 56.398 |
| 0.6319444444444444 | 56.398 |
| 0.6326388888888889 | 56.398 |
| 0.6333333333333333 | 56.398 |
| 0.6340277777777777 | 56.398 |
| 0.6347222222222222 | 56.398 |
| 0.6354166666666666 | 56.398 |
| 0.6361111111111112 | 56.398 |
| 0.6368055555555555 | 56.398 |
| 0.6375000000000001 | 56.398 |
| 0.6381944444444444 | 56.398 |
| 0.638888888888889 | 56.398 |
| 0.6395833333333333 | 56.398 |
| 0.6402777777777778 | 56.398 |
| 0.6409722222222222 | 56.398 |
| 0.6416666666666667 | 56.398 |
| 0.642361111111111 | 56.398 |
| 0.6430555555555556 | 56.398 |
| 0.6437499999999999 | 56.398 |
| 0.6444444444444445 | 56.398 |
| 0.6451388888888888 | 51.951 |
| 0.6458333333333334 | 51.951 |
| 0.6465277777777778 | 51.951 |
| 0.6472222222222223 | 51.951 |
| 0.6479166666666667 | 51.951 |
| 0.6486111111111111 | 56.398 |
| 0.6493055555555556 | 56.398 |
| 0.65 | 56.398 |
| 0.6506944444444445 | 56.398 |
| 0.6513888888888889 | 56.398 |
| 0.6520833333333333 | 60.85 |
| 0.6527777777777778 | 60.85 |
| 0.6534722222222222 | 60.85 |
| 0.6541666666666667 | 60.85 |
| 0.6548611111111111 | 60.85 |
| 0.6555555555555556 | 60.85 |
| 0.65625 | 56.398 |
| 0.6569444444444444 | 56.398 |
| 0.6576388888888889 | 56.398 |
| 0.6583333333333333 | 56.398 |
| 0.6590277777777778 | 56.398 |
| 0.6597222222222222 | 56.398 |
| 0.6604166666666667 | 56.398 |
| 0.6611111111111111 | 56.398 |
| 0.6618055555555555 | 56.398 |
| 0.6625 | 56.398 |
| 0.6631944444444444 | 56.398 |
| 0.6638888888888889 | 56.398 |
| 0.6645833333333333 | 56.398 |
| 0.6652777777777777 | 56.398 |
| 0.6659722222222222 | 56.398 |
| 0.6666666666666666 | 56.398 |
| 0.6673611111111111 | 56.398 |
| 0.6680555555555556 | 56.398 |
| 0.6687500000000001 | 56.398 |
| 0.6694444444444444 | 56.398 |
| 0.6701388888888888 | 56.398 |
| 0.6708333333333334 | 56.398 |
| 0.6715277777777778 | 56.398 |
| 0.6722222222222222 | 56.398 |
| 0.6729166666666666 | 56.398 |
| 0.6736111111111112 | 56.398 |
| 0.6743055555555556 | 51.951 |
| 0.6749999999999999 | 51.951 |
| 0.6756944444444444 | 51.951 |
| 0.6763888888888889 | 51.951 |
| 0.6770833333333334 | 51.951 |
| 0.6777777777777777 | 51.951 |
| 0.6784722222222223 | 51.951 |
| 0.6791666666666667 | 47.511 |
| 0.6798611111111111 | 47.511 |
| 0.6805555555555555 | 47.511 |
| 0.68125 | 47.511 |
| 0.6819444444444445 | 47.511 |
| 0.6826388888888889 | 43.079 |
| 0.6833333333333332 | 43.079 |
| 0.6840277777777778 | 43.079 |
| 0.6847222222222222 | 43.079 |
| 0.6854166666666667 | 43.079 |
| 0.686111111111111 | 43.079 |
| 0.6868055555555556 | 43.079 |
| 0.6875 | 43.079 |
| 0.6881944444444444 | 43.079 |
| 0.688888888888889 | 43.079 |
| 0.6895833333333333 | 43.079 |
| 0.6902777777777778 | 38.653 |
| 0.6909722222222222 | 38.653 |
| 0.6916666666666668 | 38.653 |
| 0.6923611111111111 | 38.653 |
| 0.6930555555555555 | 38.653 |
| 0.69375 | 38.653 |
| 0.6944444444444445 | 38.653 |
| 0.6951388888888889 | 38.653 |
| 0.6958333333333333 | 38.653 |
| 0.6965277777777777 | 38.653 |
| 0.6972222222222223 | 38.653 |
| 0.6979166666666666 | 34.234 |
| 0.6986111111111111 | 34.234 |
| 0.6993055555555556 | 34.234 |
| 0.7000000000000001 | 34.234 |
| 0.7006944444444444 | 29.823 |
| 0.7013888888888888 | 29.823 |
| 0.7020833333333334 | 29.823 |
| 0.7027777777777778 | 29.823 |
| 0.7034722222222222 | 29.823 |
| 0.7041666666666666 | 29.823 |
| 0.7048611111111112 | 29.823 |
| 0.7055555555555556 | 25.419 |
| 0.7062499999999999 | 25.419 |
| 0.7069444444444444 | 25.419 |
| 0.7076388888888889 | 25.419 |
| 0.7083333333333334 | 25.419 |
| 0.7090277777777777 | 25.419 |
| 0.7097222222222223 | 25.419 |
| 0.7104166666666667 | 21.024 |
| 0.7111111111111111 | 21.024 |
| 0.7118055555555555 | 21.024 |
| 0.7125 | 21.024 |
| 0.7131944444444445 | 21.024 |
| 0.7138888888888889 | 21.024 |
| 0.7145833333333332 | 21.024 |
| 0.7152777777777778 | 21.024 |
| 0.7159722222222222 | 21.024 |
| 0.7166666666666667 | 21.024 |
| 0.717361111111111 | 21.024 |
| 0.7180555555555556 | 16.636 |
| 0.71875 | 16.636 |
| 0.7194444444444444 | 16.636 |
| 0.720138888888889 | 16.636 |
| 0.7208333333333333 | 16.636 |
| 0.7215277777777778 | 16.636 |
| 0.7222222222222222 | 16.636 |
| 0.7229166666666668 | 12.257 |
| 0.7236111111111111 | 12.257 |
| 0.7243055555555555 | 12.257 |
| 0.725 | 12.257 |
| 0.7256944444444445 | 12.257 |
| 0.7263888888888889 | 12.257 |
| 0.7270833333333333 | 12.257 |
| 0.7277777777777777 | 12.257 |
| 0.7284722222222223 | 12.257 |
| 0.7291666666666666 | 12.257 |
| 0.7298611111111111 | 7.887 |
| 0.7305555555555556 | 7.887 |
| 0.7312500000000001 | 3.525 |
| 0.7319444444444444 | 3.525 |
| 0.7326388888888888 | 3.525 |
| 0.7333333333333334 | 3.525 |
| 0.7340277777777778 | 3.525 |
| 0.7347222222222222 | 3.525 |
| 0.7354166666666666 | 3.525 |
| 0.7361111111111112 | 3.525 |
| 0.7368055555555556 | 3.525 |
| 0.7374999999999999 | 3.525 |
| 0.7381944444444444 | 3.525 |
| 0.7388888888888889 | 3.525 |
| 0.7395833333333334 | 0 |
| 0.7402777777777777 | 0 |
| 0.7409722222222223 | 0 |
| 0.7416666666666667 | 0 |
| 0.7423611111111111 | 0 |
| 0.7430555555555555 | 3.525 |
| 0.74375 | 0 |
| 0.7444444444444445 | 0 |
| 0.7451388888888889 | 0 |
| 0.7458333333333332 | 0 |
| 0.7465277777777778 | 0 |
| 0.7472222222222222 | 0 |
| 0.7479166666666667 | 0 |
| 0.748611111111111 | 0 |
| 0.7493055555555556 | 0 |
| 0.75 | 0 |
| 0.7506944444444444 | 0 |
| 0.751388888888889 | 0 |
| 0.7520833333333333 | 0 |
| 0.7527777777777778 | 0 |
| 0.7534722222222222 | 0 |
| 0.7541666666666668 | 0 |
| 0.7548611111111111 | 0 |
| 0.7555555555555555 | 0 |
| 0.75625 | 0 |
| 0.7569444444444445 | 0 |
| 0.7576388888888889 | 0 |
| 0.7583333333333333 | 0 |
| 0.7590277777777777 | 0 |
| 0.7597222222222223 | 0 |
| 0.7604166666666666 | 0 |
| 0.7611111111111111 | 0 |
| 0.7618055555555556 | 0 |
| 0.7625000000000001 | 0 |
| 0.7631944444444444 | 0 |
| 0.7638888888888888 | 0 |
| 0.7645833333333334 | 0 |
| 0.7652777777777778 | 0 |
| 0.7659722222222222 | 0 |
| 0.7666666666666666 | 0 |
| 0.7673611111111112 | 0 |
| 0.7680555555555556 | 0 |
| 0.7687499999999999 | 0 |
| 0.7694444444444444 | 0 |
| 0.7701388888888889 | 0 |
| 0.7708333333333334 | 0 |
| 0.7715277777777777 | 0 |
| 0.7722222222222223 | 0 |
| 0.7729166666666667 | 0 |
| 0.7736111111111111 | 0 |
| 0.7743055555555555 | 0 |
| 0.775 | 0 |
| 0.7756944444444445 | 0 |
| 0.7763888888888889 | 0 |
| 0.7770833333333332 | 0 |
| 0.7777777777777778 | 0 |
| 0.7784722222222222 | 0 |
| 0.7791666666666667 | 0 |
| 0.779861111111111 | 0 |
| 0.7805555555555556 | 0 |
| 0.78125 | 0 |
| 0.7819444444444444 | 0 |
| 0.782638888888889 | 0 |
| 0.7833333333333333 | 0 |
| 0.7840277777777778 | 0 |
| 0.7847222222222222 | 0 |
| 0.7854166666666668 | 0 |
| 0.7861111111111111 | 0 |
| 0.7868055555555555 | 0 |
| 0.7875 | 0 |
| 0.7881944444444445 | 0 |
| 0.7888888888888889 | 0 |
| 0.7895833333333333 | 0 |
| 0.7902777777777777 | 0 |
| 0.7909722222222223 | 0 |
| 0.7916666666666666 | 0 |
| 0.7923611111111111 | 0 |
| 0.7930555555555556 | 0 |
| 0.7937500000000001 | 0 |
| 0.7944444444444444 | 0 |
| 0.7951388888888888 | 0 |
| 0.7958333333333334 | 0 |
| 0.7965277777777778 | 0 |
| 0.7972222222222222 | 0 |
| 0.7979166666666666 | 0 |
| 0.7986111111111112 | 0 |
| 0.7993055555555556 | 0 |
| 0.7999999999999999 | 0 |
| 0.8006944444444444 | 0 |
| 0.8013888888888889 | 0 |
| 0.8020833333333334 | 0 |
| 0.8027777777777777 | 0 |
| 0.8034722222222223 | 0 |
| 0.8041666666666667 | 0 |
| 0.8048611111111111 | 0 |
| 0.8055555555555555 | 0 |
| 0.80625 | 0 |
| 0.8069444444444445 | 0 |
| 0.8076388888888889 | 0 |
| 0.8083333333333332 | 0 |
| 0.8090277777777778 | 0 |
| 0.8097222222222222 | 0 |
| 0.8104166666666667 | 0 |
| 0.811111111111111 | 0 |
| 0.8118055555555556 | 0 |
| 0.8125 | 0 |
| 0.8131944444444444 | 0 |
| 0.813888888888889 | 0 |
| 0.8145833333333333 | 0 |
| 0.8152777777777778 | 0 |
| 0.8159722222222222 | 0 |
| 0.8166666666666668 | 0 |
| 0.8173611111111111 | 0 |
| 0.8180555555555555 | 0 |
| 0.81875 | 0 |
| 0.8194444444444445 | 0 |
| 0.8201388888888889 | 0 |
| 0.8208333333333333 | 0 |
| 0.8215277777777777 | 0 |
| 0.8222222222222223 | 0 |
| 0.8229166666666666 | 0 |
| 0.8236111111111111 | 0 |
| 0.8243055555555556 | 0 |
| 0.8250000000000001 | 0 |
| 0.8256944444444444 | 0 |
| 0.8263888888888888 | 0 |
| 0.8270833333333334 | 0 |
| 0.8277777777777778 | 0 |
| 0.8284722222222222 | 0 |
| 0.8291666666666666 | 0 |
| 0.8298611111111112 | 0 |
| 0.8305555555555556 | 0 |
| 0.8312499999999999 | 0 |
| 0.8319444444444444 | 0 |
| 0.8326388888888889 | 0 |
| 0.8333333333333334 | 0 |
| 0.8340277777777777 | 0 |
| 0.8347222222222223 | 0 |
| 0.8354166666666667 | 0 |
| 0.8361111111111111 | 0 |
| 0.8368055555555555 | 0 |
| 0.8375 | 0 |
| 0.8381944444444445 | 0 |
| 0.8388888888888889 | 0 |
| 0.8395833333333332 | 0 |
| 0.8402777777777778 | 0 |
| 0.8409722222222222 | 0 |
| 0.8416666666666667 | 0 |
| 0.842361111111111 | 0 |
| 0.8430555555555556 | 0 |
| 0.84375 | 0 |
| 0.8444444444444444 | 0 |
| 0.845138888888889 | 0 |
| 0.8458333333333333 | 0 |
| 0.8465277777777778 | 0 |
| 0.8472222222222222 | 0 |
| 0.8479166666666668 | 0 |
| 0.8486111111111111 | 0 |
| 0.8493055555555555 | 0 |
| 0.85 | 0 |
| 0.8506944444444445 | 0 |
| 0.8513888888888889 | 0 |
| 0.8520833333333333 | 0 |
| 0.8527777777777777 | 0 |
| 0.8534722222222223 | 0 |
| 0.8541666666666666 | 0 |
| 0.8548611111111111 | 0 |
| 0.8555555555555556 | 0 |
| 0.8562500000000001 | 0 |
| 0.8569444444444444 | 0 |
| 0.8576388888888888 | 0 |
| 0.8583333333333334 | 0 |
| 0.8590277777777778 | 0 |
| 0.8597222222222222 | 0 |
| 0.8604166666666666 | 0 |
| 0.8611111111111112 | 0 |
| 0.8618055555555556 | 0 |
| 0.8624999999999999 | 0 |
| 0.8631944444444444 | 0 |
| 0.8638888888888889 | 0 |
| 0.8645833333333334 | 0 |
| 0.8652777777777777 | 0 |
| 0.8659722222222223 | 0 |
| 0.8666666666666667 | 0 |
| 0.8673611111111111 | 0 |
| 0.8680555555555555 | 0 |
| 0.86875 | 0 |
| 0.8694444444444445 | 0 |
| 0.8701388888888889 | 0 |
| 0.8708333333333332 | 0 |
| 0.8715277777777778 | 0 |
| 0.8722222222222222 | 0 |
| 0.8729166666666667 | 0 |
| 0.873611111111111 | 0 |
| 0.8743055555555556 | 0 |
| 0.875 | 0 |
| 0.8756944444444444 | 0 |
| 0.876388888888889 | 0 |
| 0.8770833333333333 | 0 |
| 0.8777777777777778 | 0 |
| 0.8784722222222222 | 0 |
| 0.8791666666666668 | 0 |
| 0.8798611111111111 | 0 |
| 0.8805555555555555 | 0 |
| 0.88125 | 0 |
| 0.8819444444444445 | 0 |
| 0.8826388888888889 | 0 |
| 0.8833333333333333 | 0 |
| 0.8840277777777777 | 0 |
| 0.8847222222222223 | 0 |
| 0.8854166666666666 | 0 |
| 0.8861111111111111 | 0 |
| 0.8868055555555556 | 0 |
| 0.8875000000000001 | 0 |
| 0.8881944444444444 | 0 |
| 0.8888888888888888 | 0 |
| 0.8895833333333334 | 0 |
| 0.8902777777777778 | 0 |
| 0.8909722222222222 | 0 |
| 0.8916666666666666 | 0 |
| 0.8923611111111112 | 0 |
| 0.8930555555555556 | 0 |
| 0.8937499999999999 | 0 |
| 0.8944444444444444 | 0 |
| 0.8951388888888889 | 0 |
| 0.8958333333333334 | 0 |
| 0.8965277777777777 | 0 |
| 0.8972222222222223 | 0 |
| 0.8979166666666667 | 0 |
| 0.8986111111111111 | 0 |
| 0.8993055555555555 | 0 |
| 0.9 | 0 |
| 0.9006944444444445 | 0 |
| 0.9013888888888889 | 0 |
| 0.9020833333333332 | 0 |
| 0.9027777777777778 | 0 |
| 0.9034722222222222 | 0 |
| 0.9041666666666667 | 0 |
| 0.904861111111111 | 0 |
| 0.9055555555555556 | 0 |
| 0.90625 | 0 |
| 0.9069444444444444 | 0 |
| 0.907638888888889 | 0 |
| 0.9083333333333333 | 0 |
| 0.9090277777777778 | 0 |
| 0.9097222222222222 | 0 |
| 0.9104166666666668 | 0 |
| 0.9111111111111111 | 0 |
| 0.9118055555555555 | 0 |
| 0.9125 | 0 |
| 0.9131944444444445 | 0 |
| 0.9138888888888889 | 0 |
| 0.9145833333333333 | 0 |
| 0.9152777777777777 | 0 |
| 0.9159722222222223 | 0 |
| 0.9166666666666666 | 0 |
| 0.9173611111111111 | 0 |
| 0.9180555555555556 | 0 |
| 0.9187500000000001 | 0 |
| 0.9194444444444444 | 0 |
| 0.9201388888888888 | 0 |
| 0.9208333333333334 | 0 |
| 0.9215277777777778 | 0 |
| 0.9222222222222222 | 0 |
| 0.9229166666666666 | 0 |
| 0.9236111111111112 | 0 |
| 0.9243055555555556 | 0 |
| 0.9249999999999999 | 0 |
| 0.9256944444444444 | 0 |
| 0.9263888888888889 | 0 |
| 0.9270833333333334 | 0 |
| 0.9277777777777777 | 0 |
| 0.9284722222222223 | 0 |
| 0.9291666666666667 | 0 |
| 0.9298611111111111 | 0 |
| 0.9305555555555555 | 0 |
| 0.93125 | 0 |
| 0.9319444444444445 | 0 |
| 0.9326388888888889 | 0 |
| 0.9333333333333332 | 0 |
| 0.9340277777777778 | 0 |
| 0.9347222222222222 | 0 |
| 0.9354166666666667 | 0 |
| 0.936111111111111 | 0 |
| 0.9368055555555556 | 0 |
| 0.9375 | 0 |
| 0.9381944444444444 | 0 |
| 0.938888888888889 | 0 |
| 0.9395833333333333 | 0 |
| 0.9402777777777778 | 0 |
| 0.9409722222222222 | 0 |
| 0.9416666666666668 | 0 |
| 0.9423611111111111 | 0 |
| 0.9430555555555555 | 0 |
| 0.94375 | 0 |
| 0.9444444444444445 | 0 |
| 0.9451388888888889 | 0 |
| 0.9458333333333333 | 0 |
| 0.9465277777777777 | 0 |
| 0.9472222222222223 | 0 |
| 0.9479166666666666 | 0 |
| 0.9486111111111111 | 0 |
| 0.9493055555555556 | 0 |
| 0.9500000000000001 | 0 |
| 0.9506944444444444 | 0 |
| 0.9513888888888888 | 0 |
| 0.9520833333333334 | 0 |
| 0.9527777777777778 | 0 |
| 0.9534722222222222 | 0 |
| 0.9541666666666666 | 0 |
| 0.9548611111111112 | 0 |
| 0.9555555555555556 | 0 |
| 0.9562499999999999 | 0 |
| 0.9569444444444444 | 0 |
| 0.9576388888888889 | 0 |
| 0.9583333333333334 | 0 |
| 0.9590277777777777 | 0 |
| 0.9597222222222223 | 0 |
| 0.9604166666666667 | 0 |
| 0.9611111111111111 | 0 |
| 0.9618055555555555 | 0 |
| 0.9625 | 0 |
| 0.9631944444444445 | 0 |
| 0.9638888888888889 | 0 |
| 0.9645833333333332 | 0 |
| 0.9652777777777778 | 0 |
| 0.9659722222222222 | 0 |
| 0.9666666666666667 | 0 |
| 0.967361111111111 | 0 |
| 0.9680555555555556 | 0 |
| 0.96875 | 0 |
| 0.9694444444444444 | 0 |
| 0.970138888888889 | 0 |
| 0.9708333333333333 | 0 |
| 0.9715277777777778 | 0 |
| 0.9722222222222222 | 0 |
| 0.9729166666666668 | 0 |
| 0.9736111111111111 | 0 |
| 0.9743055555555555 | 0 |
| 0.975 | 0 |
| 0.9756944444444445 | 0 |
| 0.9763888888888889 | 0 |
| 0.9770833333333333 | 0 |
| 0.9777777777777777 | 0 |
| 0.9784722222222223 | 0 |
| 0.9791666666666666 | 0 |
| 0.9798611111111111 | 0 |
| 0.9805555555555556 | 0 |
| 0.9812500000000001 | 0 |
| 0.9819444444444444 | 0 |
| 0.9826388888888888 | 0 |
| 0.9833333333333334 | 0 |
| 0.9840277777777778 | 0 |
| 0.9847222222222222 | 0 |
| 0.9854166666666666 | 0 |
| 0.9861111111111112 | 0 |
| 0.9868055555555556 | 0 |
| 0.9874999999999999 | 0 |
| 0.9881944444444444 | 0 |
| 0.9888888888888889 | 0 |
| 0.9895833333333334 | 0 |
| 0.9902777777777777 | 0 |
| 0.9909722222222223 | 0 |
| 0.9916666666666667 | 0 |
| 0.9923611111111111 | 0 |
| 0.9930555555555555 | 0 |
| 0.99375 | 0 |
| 0.9944444444444445 | 0 |
| 0.9951388888888889 | 0 |
| 0.9958333333333332 | 0 |
| 0.9965277777777778 | 0 |
| 0.9972222222222222 | 0 |
| 0.9979166666666667 | 0 |
| 0.998611111111111 | 0 |
| 0.9993055555555556 | 0 |